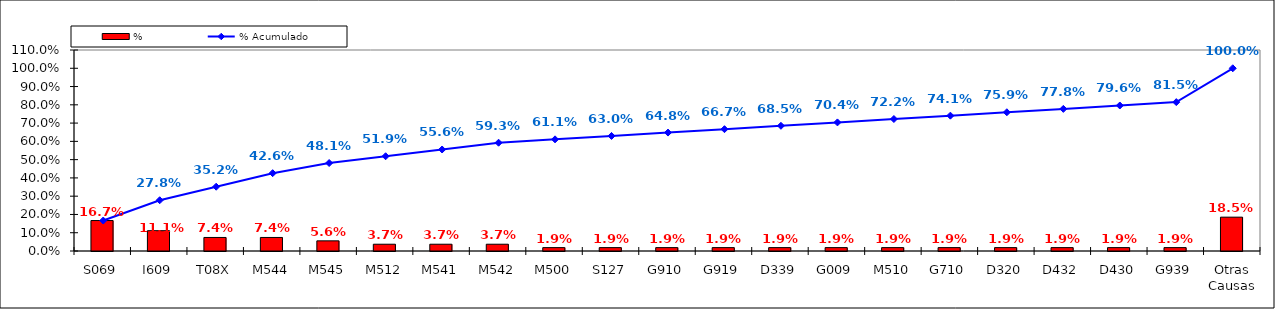
| Category | % |
|---|---|
| S069 | 0.167 |
| I609 | 0.111 |
| T08X | 0.074 |
| M544 | 0.074 |
| M545 | 0.056 |
| M512 | 0.037 |
| M541 | 0.037 |
| M542 | 0.037 |
| M500 | 0.019 |
| S127 | 0.019 |
| G910 | 0.019 |
| G919 | 0.019 |
| D339 | 0.019 |
| G009 | 0.019 |
| M510 | 0.019 |
| G710 | 0.019 |
| D320 | 0.019 |
| D432 | 0.019 |
| D430 | 0.019 |
| G939 | 0.019 |
| Otras Causas | 0.185 |